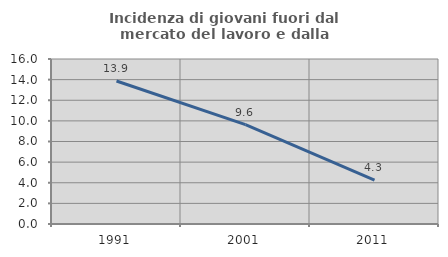
| Category | Incidenza di giovani fuori dal mercato del lavoro e dalla formazione  |
|---|---|
| 1991.0 | 13.869 |
| 2001.0 | 9.639 |
| 2011.0 | 4.255 |